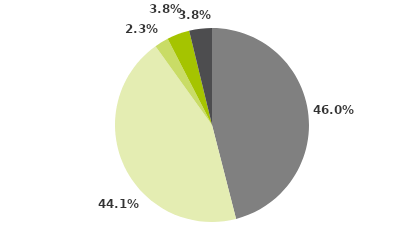
| Category | Series 0 |
|---|---|
| Multimercados Macro | 0.46 |
| Multimercados Livre | 0.441 |
| Multimercados L/S - Neutro | 0.023 |
| Multimercados L/S - Direcional | 0.038 |
| Outros | 0.038 |